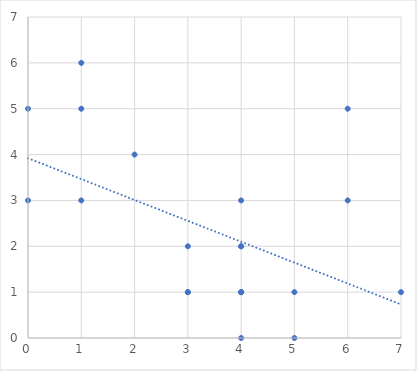
| Category | Series 0 |
|---|---|
| 4.0 | 0 |
| 1.0 | 3 |
| 3.0 | 1 |
| 0.0 | 3 |
| 1.0 | 5 |
| 4.0 | 1 |
| 6.0 | 5 |
| 6.0 | 3 |
| 5.0 | 1 |
| 3.0 | 2 |
| 2.0 | 4 |
| 1.0 | 6 |
| 0.0 | 5 |
| 4.0 | 2 |
| 4.0 | 3 |
| 4.0 | 2 |
| 3.0 | 1 |
| 4.0 | 1 |
| 4.0 | 1 |
| 5.0 | 0 |
| 7.0 | 1 |